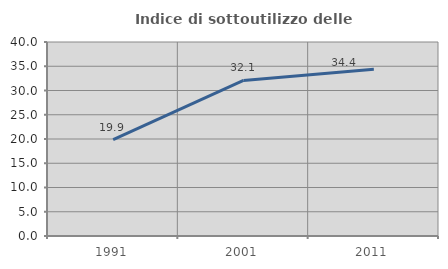
| Category | Indice di sottoutilizzo delle abitazioni  |
|---|---|
| 1991.0 | 19.869 |
| 2001.0 | 32.067 |
| 2011.0 | 34.398 |